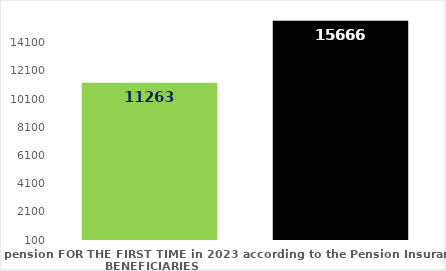
| Category | broj korisnika |
|---|---|
| Pension beneficiaries entitled to pension FOR THE FIRST TIME in 2023 according to the Pension Insurance Act  - NEW BENEFICIARIES | 11263 |
| Pension beneficiaries whose pension entitlement ceased in 2023  -  death caused,   
and who were retired according to the Pension Insurance Act   | 15666 |